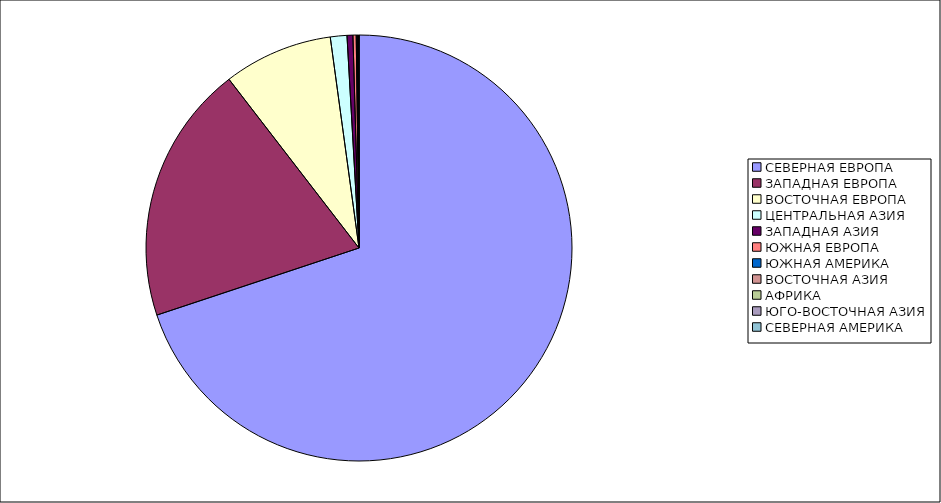
| Category | Оборот |
|---|---|
| СЕВЕРНАЯ ЕВРОПА | 69.9 |
| ЗАПАДНАЯ ЕВРОПА | 19.65 |
| ВОСТОЧНАЯ ЕВРОПА | 8.292 |
| ЦЕНТРАЛЬНАЯ АЗИЯ | 1.258 |
| ЗАПАДНАЯ АЗИЯ | 0.444 |
| ЮЖНАЯ ЕВРОПА | 0.249 |
| ЮЖНАЯ АМЕРИКА | 0.081 |
| ВОСТОЧНАЯ АЗИЯ | 0.061 |
| АФРИКА | 0.031 |
| ЮГО-ВОСТОЧНАЯ АЗИЯ | 0.031 |
| СЕВЕРНАЯ АМЕРИКА | 0.003 |